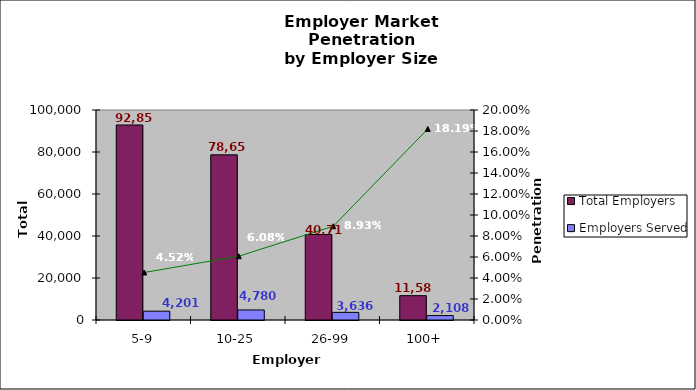
| Category | Total Employers | Employers Served |
|---|---|---|
| 5-9 | 92859 | 4201 |
| 10-25 | 78658 | 4780 |
| 26-99 | 40714 | 3636 |
| 100+ | 11586 | 2108 |